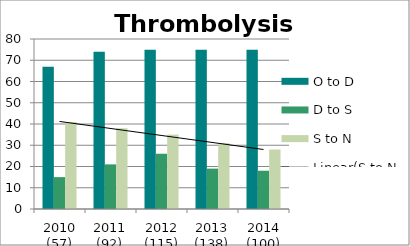
| Category | O to D | D to S | S to N |
|---|---|---|---|
| 2010 (57) | 67 | 15 | 41 |
| 2011 (92) | 74 | 21 | 38 |
| 2012 (115) | 75 | 26 | 35 |
| 2013 (138) | 75 | 19 | 31 |
| 2014 (100) | 75 | 18 | 28 |